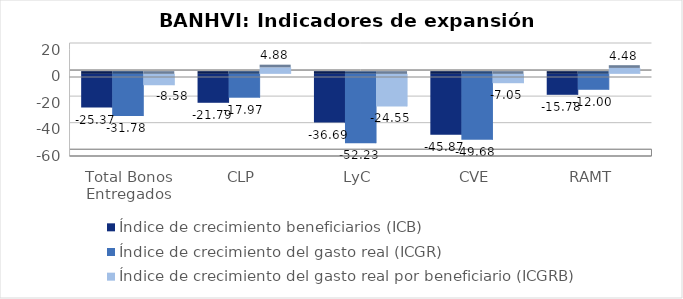
| Category | Índice de crecimiento beneficiarios (ICB)  | Índice de crecimiento del gasto real (ICGR)  | Índice de crecimiento del gasto real por beneficiario (ICGRB)  |
|---|---|---|---|
| Total Bonos Entregados | -25.371 | -31.775 | -8.581 |
| CLP | -21.787 | -17.972 | 4.878 |
| LyC | -36.69 | -52.233 | -24.551 |
| CVE | -45.866 | -49.682 | -7.049 |
| RAMT | -15.776 | -12.002 | 4.48 |